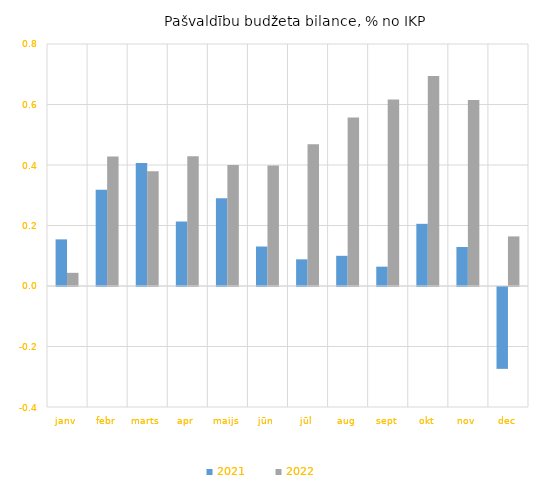
| Category | 2021 | 2022 |
|---|---|---|
| janv | 0.154 | 0.044 |
| febr | 0.318 | 0.428 |
| marts | 0.407 | 0.379 |
| apr | 0.213 | 0.429 |
| maijs | 0.29 | 0.4 |
| jūn | 0.131 | 0.398 |
| jūl | 0.088 | 0.469 |
| aug | 0.1 | 0.557 |
| sept | 0.064 | 0.617 |
| okt | 0.206 | 0.694 |
| nov | 0.129 | 0.615 |
| dec | -0.271 | 0.164 |